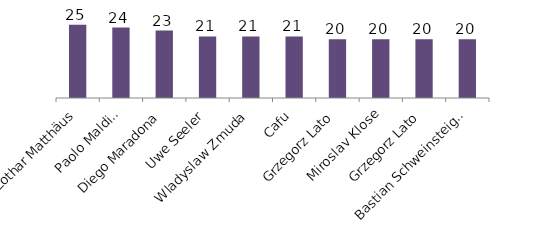
| Category | Games Played |
|---|---|
| Lothar Matthäus | 25 |
| Paolo Maldini | 24 |
| Diego Maradona | 23 |
| Uwe Seeler | 21 |
| Wladyslaw Zmuda | 21 |
| Cafu | 21 |
| Grzegorz Lato | 20 |
| Miroslav Klose | 20 |
| Grzegorz Lato | 20 |
| Bastian Schweinsteiger | 20 |